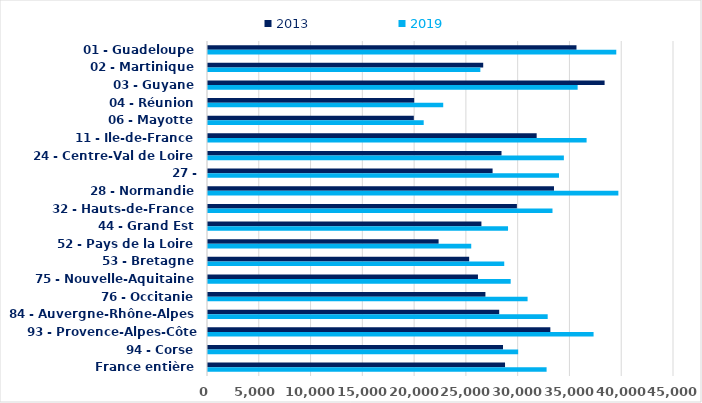
| Category | 2013 | 2019 |
|---|---|---|
| 01 - Guadeloupe | 35583 | 39426 |
| 02 - Martinique | 26576 | 26299 |
| 03 - Guyane | 38298 | 35695 |
| 04 - Réunion | 19910 | 22715 |
| 06 - Mayotte | 19876 | 20829 |
| 11 - Ile-de-France | 31738 | 36560 |
| 24 - Centre-Val de Loire | 28342 | 34365 |
| 27 - Bourgogne-Franche-Comté | 27482 | 33893 |
| 28 - Normandie | 33411 | 39627 |
| 32 - Hauts-de-France | 29829 | 33266 |
| 44 - Grand Est | 26403 | 28974 |
| 52 - Pays de la Loire | 22268 | 25420 |
| 53 - Bretagne | 25219 | 28607 |
| 75 - Nouvelle-Aquitaine | 26069 | 29229 |
| 76 - Occitanie | 26789 | 30861 |
| 84 - Auvergne-Rhône-Alpes | 28120 | 32802 |
| 93 - Provence-Alpes-Côte d'Azur | 33059 | 37233 |
| 94 - Corse | 28488 | 29950 |
| France entière | 28684 | 32697 |